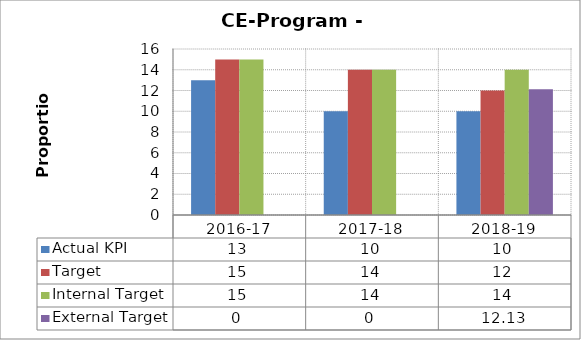
| Category | Actual KPI | Target  | Internal Target | External Target  |
|---|---|---|---|---|
| 2016-17 | 13 | 15 | 15 | 0 |
| 2017-18 | 10 | 14 | 14 | 0 |
| 2018-19 | 10 | 12 | 14 | 12.13 |